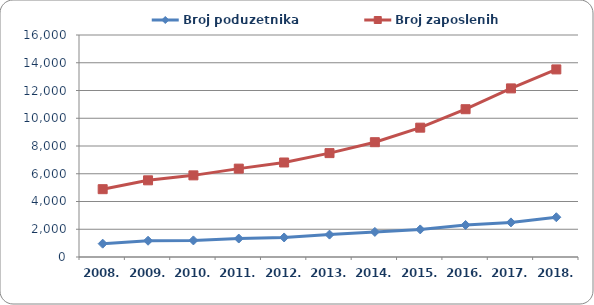
| Category | Broj poduzetnika  | Broj zaposlenih  |
|---|---|---|
| 2008. | 960 | 4888 |
| 2009. | 1173 | 5526 |
| 2010. | 1195 | 5884 |
| 2011. | 1330 | 6369 |
| 2012. | 1408 | 6811 |
| 2013. | 1613 | 7487 |
| 2014. | 1809 | 8274 |
| 2015. | 1988 | 9321 |
| 2016. | 2307 | 10652 |
| 2017. | 2494 | 12152 |
| 2018. | 2865 | 13520 |